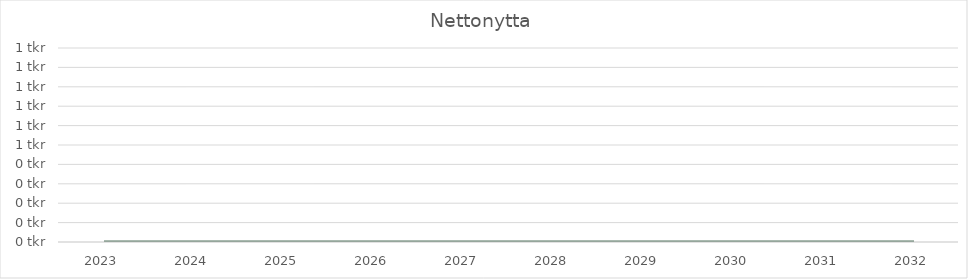
| Category | Nettonytta |
|---|---|
| 2023.0 | 0 |
| 2024.0 | 0 |
| 2025.0 | 0 |
| 2026.0 | 0 |
| 2027.0 | 0 |
| 2028.0 | 0 |
| 2029.0 | 0 |
| 2030.0 | 0 |
| 2031.0 | 0 |
| 2032.0 | 0 |